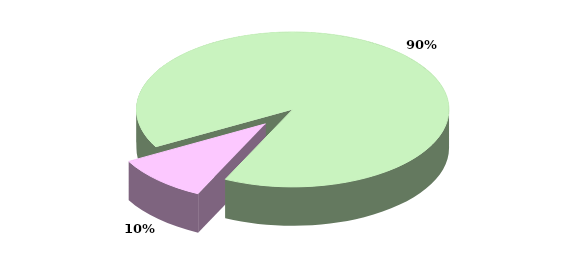
| Category | Series 0 |
|---|---|
| TOTALE ENTRATE CORRENTI | 22236.15 |
| TOTALE ENTRATE IN CONTO CAPITALE | 2428.867 |